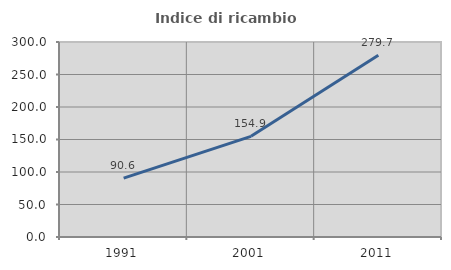
| Category | Indice di ricambio occupazionale  |
|---|---|
| 1991.0 | 90.643 |
| 2001.0 | 154.911 |
| 2011.0 | 279.747 |